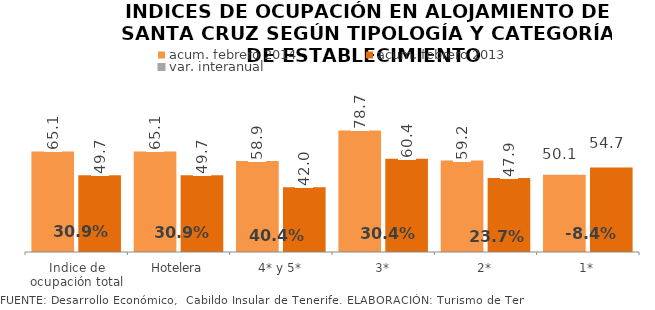
| Category | acum. febrero 2014 | acum. febrero 2013 |
|---|---|---|
| Indice de ocupación total | 65.094 | 49.712 |
| Hotelera | 65.094 | 49.712 |
| 4* y 5* | 58.933 | 41.973 |
| 3* | 78.722 | 60.37 |
| 2* | 59.231 | 47.898 |
| 1* | 50.065 | 54.666 |